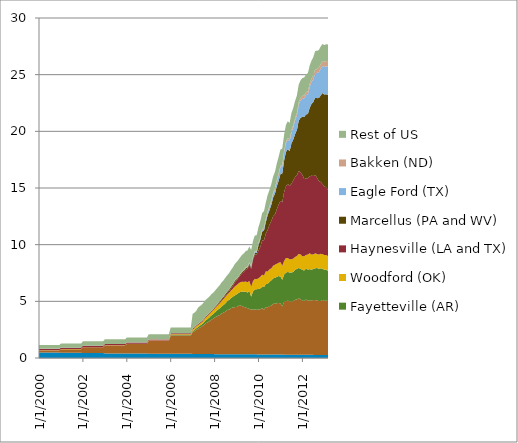
| Category | Antrim (MI, IN, and OH) | Barnett (TX) | Fayetteville (AR) | Woodford (OK) | Haynesville (LA and TX) | Marcellus (PA and WV) | Eagle Ford (TX) | Bakken (ND) | Rest of US |
|---|---|---|---|---|---|---|---|---|---|
| 1/1/00 | 0.481 | 0.184 | 0 | 0.009 | 0.128 | 0.001 | 0 | 0.005 | 0.332 |
| 2/1/00 | 0.481 | 0.184 | 0 | 0.009 | 0.128 | 0.001 | 0 | 0.005 | 0.332 |
| 3/1/00 | 0.481 | 0.184 | 0 | 0.009 | 0.128 | 0.001 | 0 | 0.005 | 0.332 |
| 4/1/00 | 0.481 | 0.184 | 0 | 0.009 | 0.128 | 0.001 | 0 | 0.005 | 0.332 |
| 5/1/00 | 0.481 | 0.184 | 0 | 0.009 | 0.128 | 0.001 | 0 | 0.005 | 0.332 |
| 6/1/00 | 0.481 | 0.184 | 0 | 0.009 | 0.128 | 0.001 | 0 | 0.005 | 0.332 |
| 7/1/00 | 0.481 | 0.184 | 0 | 0.009 | 0.128 | 0.001 | 0 | 0.005 | 0.332 |
| 8/1/00 | 0.481 | 0.184 | 0 | 0.009 | 0.128 | 0.001 | 0 | 0.005 | 0.332 |
| 9/1/00 | 0.481 | 0.184 | 0 | 0.009 | 0.128 | 0.001 | 0 | 0.005 | 0.332 |
| 10/1/00 | 0.481 | 0.184 | 0 | 0.009 | 0.128 | 0.001 | 0 | 0.005 | 0.332 |
| 11/1/00 | 0.481 | 0.184 | 0 | 0.009 | 0.128 | 0.001 | 0 | 0.005 | 0.332 |
| 12/1/00 | 0.481 | 0.184 | 0 | 0.009 | 0.128 | 0.001 | 0 | 0.005 | 0.332 |
| 1/1/01 | 0.461 | 0.314 | 0 | 0.009 | 0.125 | 0.001 | 0 | 0.005 | 0.359 |
| 2/1/01 | 0.461 | 0.314 | 0 | 0.009 | 0.125 | 0.001 | 0 | 0.005 | 0.359 |
| 3/1/01 | 0.461 | 0.314 | 0 | 0.009 | 0.125 | 0.001 | 0 | 0.005 | 0.359 |
| 4/1/01 | 0.461 | 0.314 | 0 | 0.009 | 0.125 | 0.001 | 0 | 0.005 | 0.359 |
| 5/1/01 | 0.461 | 0.314 | 0 | 0.009 | 0.125 | 0.001 | 0 | 0.005 | 0.359 |
| 6/1/01 | 0.461 | 0.314 | 0 | 0.009 | 0.125 | 0.001 | 0 | 0.005 | 0.359 |
| 7/1/01 | 0.461 | 0.314 | 0 | 0.009 | 0.125 | 0.001 | 0 | 0.005 | 0.359 |
| 8/1/01 | 0.461 | 0.314 | 0 | 0.009 | 0.125 | 0.001 | 0 | 0.005 | 0.359 |
| 9/1/01 | 0.461 | 0.314 | 0 | 0.009 | 0.125 | 0.001 | 0 | 0.005 | 0.359 |
| 10/1/01 | 0.461 | 0.314 | 0 | 0.009 | 0.125 | 0.001 | 0 | 0.005 | 0.359 |
| 11/1/01 | 0.461 | 0.314 | 0 | 0.009 | 0.125 | 0.001 | 0 | 0.005 | 0.359 |
| 12/1/01 | 0.461 | 0.314 | 0 | 0.009 | 0.125 | 0.001 | 0 | 0.005 | 0.359 |
| 1/1/02 | 0.438 | 0.508 | 0 | 0.009 | 0.121 | 0 | 0 | 0.004 | 0.39 |
| 2/1/02 | 0.438 | 0.508 | 0 | 0.009 | 0.121 | 0 | 0 | 0.004 | 0.39 |
| 3/1/02 | 0.438 | 0.508 | 0 | 0.009 | 0.121 | 0 | 0 | 0.004 | 0.39 |
| 4/1/02 | 0.438 | 0.508 | 0 | 0.009 | 0.121 | 0 | 0 | 0.004 | 0.39 |
| 5/1/02 | 0.438 | 0.508 | 0 | 0.009 | 0.121 | 0 | 0 | 0.004 | 0.39 |
| 6/1/02 | 0.438 | 0.508 | 0 | 0.009 | 0.121 | 0 | 0 | 0.004 | 0.39 |
| 7/1/02 | 0.438 | 0.508 | 0 | 0.009 | 0.121 | 0 | 0 | 0.004 | 0.39 |
| 8/1/02 | 0.438 | 0.508 | 0 | 0.009 | 0.121 | 0 | 0 | 0.004 | 0.39 |
| 9/1/02 | 0.438 | 0.508 | 0 | 0.009 | 0.121 | 0 | 0 | 0.004 | 0.39 |
| 10/1/02 | 0.438 | 0.508 | 0 | 0.009 | 0.121 | 0 | 0 | 0.004 | 0.39 |
| 11/1/02 | 0.438 | 0.508 | 0 | 0.009 | 0.121 | 0 | 0 | 0.004 | 0.39 |
| 12/1/02 | 0.438 | 0.508 | 0 | 0.009 | 0.121 | 0 | 0 | 0.004 | 0.39 |
| 1/1/03 | 0.405 | 0.706 | 0 | 0.01 | 0.106 | 0 | 0 | 0.004 | 0.414 |
| 2/1/03 | 0.405 | 0.706 | 0 | 0.01 | 0.106 | 0 | 0 | 0.004 | 0.414 |
| 3/1/03 | 0.405 | 0.706 | 0 | 0.01 | 0.106 | 0 | 0 | 0.004 | 0.414 |
| 4/1/03 | 0.405 | 0.706 | 0 | 0.01 | 0.106 | 0 | 0 | 0.004 | 0.414 |
| 5/1/03 | 0.405 | 0.706 | 0 | 0.01 | 0.106 | 0 | 0 | 0.004 | 0.414 |
| 6/1/03 | 0.405 | 0.706 | 0 | 0.01 | 0.106 | 0 | 0 | 0.004 | 0.414 |
| 7/1/03 | 0.405 | 0.706 | 0 | 0.01 | 0.106 | 0 | 0 | 0.004 | 0.414 |
| 8/1/03 | 0.405 | 0.706 | 0 | 0.01 | 0.106 | 0 | 0 | 0.004 | 0.414 |
| 9/1/03 | 0.405 | 0.706 | 0 | 0.01 | 0.106 | 0 | 0 | 0.004 | 0.414 |
| 10/1/03 | 0.405 | 0.706 | 0 | 0.01 | 0.106 | 0 | 0 | 0.004 | 0.414 |
| 11/1/03 | 0.405 | 0.706 | 0 | 0.01 | 0.106 | 0 | 0 | 0.004 | 0.414 |
| 12/1/03 | 0.405 | 0.706 | 0 | 0.01 | 0.106 | 0 | 0 | 0.004 | 0.414 |
| 1/1/04 | 0.391 | 0.857 | 0 | 0.015 | 0.097 | 0 | 0 | 0.004 | 0.437 |
| 2/1/04 | 0.391 | 0.857 | 0 | 0.015 | 0.097 | 0 | 0 | 0.004 | 0.437 |
| 3/1/04 | 0.391 | 0.857 | 0 | 0.015 | 0.097 | 0 | 0 | 0.004 | 0.437 |
| 4/1/04 | 0.391 | 0.857 | 0 | 0.015 | 0.097 | 0 | 0 | 0.004 | 0.437 |
| 5/1/04 | 0.391 | 0.857 | 0 | 0.015 | 0.097 | 0 | 0 | 0.004 | 0.437 |
| 6/1/04 | 0.391 | 0.857 | 0 | 0.015 | 0.097 | 0 | 0 | 0.004 | 0.437 |
| 7/1/04 | 0.391 | 0.857 | 0 | 0.015 | 0.097 | 0 | 0 | 0.004 | 0.437 |
| 8/1/04 | 0.391 | 0.857 | 0 | 0.015 | 0.097 | 0 | 0 | 0.004 | 0.437 |
| 9/1/04 | 0.391 | 0.857 | 0 | 0.015 | 0.097 | 0 | 0 | 0.004 | 0.437 |
| 10/1/04 | 0.391 | 0.857 | 0 | 0.015 | 0.097 | 0 | 0 | 0.004 | 0.437 |
| 11/1/04 | 0.391 | 0.857 | 0 | 0.015 | 0.097 | 0 | 0 | 0.004 | 0.437 |
| 12/1/04 | 0.391 | 0.857 | 0 | 0.015 | 0.097 | 0 | 0 | 0.004 | 0.437 |
| 1/1/05 | 0.381 | 1.134 | 0.006 | 0.025 | 0.091 | 0.002 | 0 | 0.005 | 0.459 |
| 2/1/05 | 0.381 | 1.134 | 0.006 | 0.025 | 0.091 | 0.002 | 0 | 0.005 | 0.459 |
| 3/1/05 | 0.381 | 1.134 | 0.006 | 0.025 | 0.091 | 0.002 | 0 | 0.005 | 0.459 |
| 4/1/05 | 0.381 | 1.134 | 0.006 | 0.025 | 0.091 | 0.002 | 0 | 0.005 | 0.459 |
| 5/1/05 | 0.381 | 1.134 | 0.006 | 0.025 | 0.091 | 0.002 | 0 | 0.005 | 0.459 |
| 6/1/05 | 0.381 | 1.134 | 0.006 | 0.025 | 0.091 | 0.002 | 0 | 0.005 | 0.459 |
| 7/1/05 | 0.381 | 1.134 | 0.006 | 0.025 | 0.091 | 0.002 | 0 | 0.005 | 0.459 |
| 8/1/05 | 0.381 | 1.134 | 0.006 | 0.025 | 0.091 | 0.002 | 0 | 0.005 | 0.459 |
| 9/1/05 | 0.381 | 1.134 | 0.006 | 0.025 | 0.091 | 0.002 | 0 | 0.005 | 0.459 |
| 10/1/05 | 0.381 | 1.134 | 0.006 | 0.025 | 0.091 | 0.002 | 0 | 0.005 | 0.459 |
| 11/1/05 | 0.381 | 1.134 | 0.006 | 0.025 | 0.091 | 0.002 | 0 | 0.005 | 0.459 |
| 12/1/05 | 0.381 | 1.134 | 0.006 | 0.025 | 0.091 | 0.002 | 0 | 0.005 | 0.459 |
| 1/1/06 | 0.373 | 1.61 | 0.04 | 0.071 | 0.082 | 0.012 | 0 | 0.007 | 0.506 |
| 2/1/06 | 0.373 | 1.61 | 0.04 | 0.071 | 0.082 | 0.012 | 0 | 0.007 | 0.506 |
| 3/1/06 | 0.373 | 1.61 | 0.04 | 0.071 | 0.082 | 0.012 | 0 | 0.007 | 0.506 |
| 4/1/06 | 0.373 | 1.61 | 0.04 | 0.071 | 0.082 | 0.012 | 0 | 0.007 | 0.506 |
| 5/1/06 | 0.373 | 1.61 | 0.04 | 0.071 | 0.082 | 0.012 | 0 | 0.007 | 0.506 |
| 6/1/06 | 0.373 | 1.61 | 0.04 | 0.071 | 0.082 | 0.012 | 0 | 0.007 | 0.506 |
| 7/1/06 | 0.373 | 1.61 | 0.04 | 0.071 | 0.082 | 0.012 | 0 | 0.007 | 0.506 |
| 8/1/06 | 0.373 | 1.61 | 0.04 | 0.071 | 0.082 | 0.012 | 0 | 0.007 | 0.506 |
| 9/1/06 | 0.373 | 1.61 | 0.04 | 0.071 | 0.082 | 0.012 | 0 | 0.007 | 0.506 |
| 10/1/06 | 0.373 | 1.61 | 0.04 | 0.071 | 0.082 | 0.012 | 0 | 0.007 | 0.506 |
| 11/1/06 | 0.373 | 1.61 | 0.04 | 0.071 | 0.082 | 0.012 | 0 | 0.007 | 0.506 |
| 12/1/06 | 0.373 | 1.61 | 0.04 | 0.071 | 0.082 | 0.012 | 0 | 0.007 | 0.506 |
| 1/1/07 | 0.362 | 1.921 | 0.099 | 0.131 | 0.081 | 0.02 | 0 | 0.009 | 1.271 |
| 2/1/07 | 0.362 | 1.999 | 0.115 | 0.146 | 0.081 | 0.022 | 0 | 0.009 | 1.271 |
| 3/1/07 | 0.362 | 2.123 | 0.138 | 0.166 | 0.079 | 0.023 | 0 | 0.009 | 1.271 |
| 4/1/07 | 0.363 | 2.208 | 0.157 | 0.176 | 0.077 | 0.024 | 0 | 0.013 | 1.434 |
| 5/1/07 | 0.363 | 2.33 | 0.171 | 0.173 | 0.078 | 0.024 | 0 | 0.013 | 1.434 |
| 6/1/07 | 0.363 | 2.41 | 0.193 | 0.189 | 0.078 | 0.026 | 0 | 0.013 | 1.434 |
| 7/1/07 | 0.36 | 2.523 | 0.227 | 0.21 | 0.077 | 0.026 | 0 | 0.016 | 1.452 |
| 8/1/07 | 0.36 | 2.692 | 0.26 | 0.231 | 0.078 | 0.025 | 0 | 0.016 | 1.452 |
| 9/1/07 | 0.36 | 2.769 | 0.288 | 0.257 | 0.08 | 0.029 | 0 | 0.016 | 1.452 |
| 10/1/07 | 0.358 | 2.869 | 0.329 | 0.283 | 0.081 | 0.031 | 0 | 0.019 | 1.426 |
| 11/1/07 | 0.358 | 2.989 | 0.376 | 0.296 | 0.081 | 0.034 | 0 | 0.019 | 1.426 |
| 12/1/07 | 0.358 | 3.086 | 0.405 | 0.322 | 0.081 | 0.036 | 0 | 0.019 | 1.426 |
| 1/1/08 | 0.338 | 3.224 | 0.436 | 0.352 | 0.085 | 0.036 | 0 | 0.015 | 1.41 |
| 2/1/08 | 0.338 | 3.325 | 0.493 | 0.366 | 0.083 | 0.057 | 0 | 0.015 | 1.41 |
| 3/1/08 | 0.338 | 3.398 | 0.564 | 0.398 | 0.084 | 0.077 | 0 | 0.015 | 1.41 |
| 4/1/08 | 0.337 | 3.467 | 0.598 | 0.443 | 0.096 | 0.09 | 0.001 | 0.022 | 1.415 |
| 5/1/08 | 0.337 | 3.602 | 0.633 | 0.494 | 0.102 | 0.109 | 0.001 | 0.022 | 1.415 |
| 6/1/08 | 0.337 | 3.674 | 0.683 | 0.528 | 0.103 | 0.117 | 0.002 | 0.022 | 1.415 |
| 7/1/08 | 0.339 | 3.765 | 0.737 | 0.569 | 0.115 | 0.136 | 0 | 0.029 | 1.423 |
| 8/1/08 | 0.339 | 3.908 | 0.791 | 0.561 | 0.128 | 0.14 | 0 | 0.029 | 1.423 |
| 9/1/08 | 0.339 | 3.917 | 0.874 | 0.63 | 0.151 | 0.139 | 0.002 | 0.029 | 1.423 |
| 10/1/08 | 0.333 | 4.068 | 0.902 | 0.66 | 0.183 | 0.148 | 0.004 | 0.037 | 1.438 |
| 11/1/08 | 0.333 | 4.12 | 0.952 | 0.712 | 0.247 | 0.149 | 0.004 | 0.037 | 1.438 |
| 12/1/08 | 0.333 | 4.152 | 1.034 | 0.788 | 0.347 | 0.155 | 0.004 | 0.037 | 1.438 |
| 1/1/09 | 0.326 | 4.178 | 1.109 | 0.81 | 0.402 | 0.134 | 0.005 | 0.039 | 1.457 |
| 2/1/09 | 0.326 | 4.274 | 1.131 | 0.839 | 0.488 | 0.096 | 0.008 | 0.039 | 1.457 |
| 3/1/09 | 0.326 | 4.3 | 1.196 | 0.864 | 0.586 | 0.111 | 0.011 | 0.039 | 1.457 |
| 4/1/09 | 0.327 | 4.259 | 1.282 | 0.866 | 0.739 | 0.115 | 0.014 | 0.048 | 1.448 |
| 5/1/09 | 0.327 | 4.181 | 1.343 | 0.862 | 0.885 | 0.121 | 0.018 | 0.048 | 1.448 |
| 6/1/09 | 0.327 | 4.122 | 1.417 | 0.879 | 1.05 | 0.12 | 0.023 | 0.048 | 1.448 |
| 7/1/09 | 0.331 | 4.066 | 1.384 | 0.899 | 1.19 | 0.122 | 0.031 | 0.058 | 1.415 |
| 8/1/09 | 0.331 | 3.996 | 1.59 | 0.876 | 1.397 | 0.131 | 0.041 | 0.058 | 1.415 |
| 9/1/09 | 0.331 | 3.942 | 1.141 | 0.866 | 1.587 | 0.14 | 0.052 | 0.058 | 1.415 |
| 10/1/09 | 0.323 | 3.971 | 1.585 | 0.912 | 1.864 | 0.145 | 0.075 | 0.062 | 1.387 |
| 11/1/09 | 0.323 | 3.954 | 1.773 | 0.934 | 2.129 | 0.144 | 0.108 | 0.062 | 1.387 |
| 12/1/09 | 0.323 | 3.935 | 1.815 | 0.886 | 2.181 | 0.131 | 0.108 | 0.062 | 1.387 |
| 1/1/10 | 0.312 | 3.963 | 1.811 | 0.944 | 2.444 | 0.474 | 0.119 | 0.08 | 1.416 |
| 2/1/10 | 0.312 | 3.988 | 1.841 | 1.025 | 2.654 | 0.628 | 0.127 | 0.08 | 1.416 |
| 3/1/10 | 0.312 | 4.085 | 1.898 | 1.055 | 3.014 | 0.786 | 0.139 | 0.08 | 1.416 |
| 4/1/10 | 0.308 | 3.949 | 2 | 1.026 | 3.11 | 0.858 | 0.157 | 0.101 | 1.439 |
| 5/1/10 | 0.308 | 4.189 | 2.028 | 1.122 | 3.316 | 1.025 | 0.192 | 0.101 | 1.439 |
| 6/1/10 | 0.308 | 4.157 | 2.071 | 1.096 | 3.661 | 1.309 | 0.237 | 0.101 | 1.439 |
| 7/1/10 | 0.308 | 4.268 | 2.142 | 1.1 | 3.94 | 1.279 | 0.245 | 0.122 | 1.424 |
| 8/1/10 | 0.308 | 4.314 | 2.228 | 1.061 | 4.172 | 1.433 | 0.278 | 0.122 | 1.424 |
| 9/1/10 | 0.308 | 4.467 | 2.259 | 1.097 | 4.374 | 1.647 | 0.323 | 0.122 | 1.424 |
| 10/1/10 | 0.305 | 4.479 | 2.284 | 1.165 | 4.43 | 1.822 | 0.36 | 0.139 | 1.447 |
| 11/1/10 | 0.305 | 4.534 | 2.317 | 1.153 | 4.808 | 2.04 | 0.413 | 0.139 | 1.447 |
| 12/1/10 | 0.305 | 4.55 | 2.378 | 1.174 | 5.145 | 2.074 | 0.536 | 0.139 | 1.447 |
| 1/1/11 | 0.299 | 4.517 | 2.373 | 1.26 | 5.415 | 2.378 | 0.598 | 0.123 | 1.435 |
| 2/1/11 | 0.299 | 4.257 | 2.345 | 1.237 | 5.604 | 2.537 | 0.645 | 0.123 | 1.435 |
| 3/1/11 | 0.299 | 4.645 | 2.412 | 1.202 | 6.081 | 2.78 | 0.723 | 0.123 | 1.435 |
| 4/1/11 | 0.292 | 4.714 | 2.529 | 1.286 | 6.336 | 3.016 | 0.774 | 0.137 | 1.48 |
| 5/1/11 | 0.292 | 4.774 | 2.532 | 1.222 | 6.553 | 3.062 | 0.841 | 0.137 | 1.48 |
| 6/1/11 | 0.292 | 4.71 | 2.536 | 1.169 | 6.471 | 3.062 | 0.884 | 0.137 | 1.48 |
| 7/1/11 | 0.295 | 4.689 | 2.565 | 1.162 | 6.647 | 3.572 | 0.964 | 0.182 | 1.53 |
| 8/1/11 | 0.295 | 4.727 | 2.565 | 1.179 | 6.906 | 3.596 | 1.08 | 0.182 | 1.53 |
| 9/1/11 | 0.295 | 4.834 | 2.661 | 1.125 | 7.05 | 3.791 | 1.226 | 0.182 | 1.53 |
| 10/1/11 | 0.291 | 4.873 | 2.696 | 1.146 | 7.115 | 3.98 | 1.305 | 0.22 | 1.549 |
| 11/1/11 | 0.291 | 4.966 | 2.682 | 1.244 | 7.313 | 4.439 | 1.428 | 0.22 | 1.549 |
| 12/1/11 | 0.291 | 4.886 | 2.702 | 1.263 | 7.23 | 4.829 | 1.533 | 0.22 | 1.549 |
| 1/1/12 | 0.284 | 4.777 | 2.71 | 1.2 | 7.183 | 5.128 | 1.586 | 0.256 | 1.58 |
| 2/1/12 | 0.284 | 4.749 | 2.685 | 1.26 | 6.806 | 5.481 | 1.647 | 0.256 | 1.58 |
| 3/1/12 | 0.284 | 4.881 | 2.722 | 1.204 | 6.763 | 5.64 | 1.705 | 0.256 | 1.58 |
| 4/1/12 | 0.279 | 4.765 | 2.756 | 1.336 | 6.714 | 5.68 | 1.724 | 0.3 | 1.585 |
| 5/1/12 | 0.279 | 4.829 | 2.734 | 1.4 | 6.785 | 6.048 | 1.852 | 0.3 | 1.585 |
| 6/1/12 | 0.279 | 4.773 | 2.737 | 1.342 | 6.957 | 6.347 | 1.928 | 0.3 | 1.585 |
| 7/1/12 | 0.275 | 4.852 | 2.733 | 1.281 | 6.91 | 6.547 | 2.003 | 0.341 | 1.617 |
| 8/1/12 | 0.275 | 4.825 | 2.818 | 1.321 | 6.92 | 6.834 | 2.144 | 0.341 | 1.617 |
| 9/1/12 | 0.275 | 4.817 | 2.846 | 1.241 | 6.731 | 7.018 | 2.216 | 0.341 | 1.617 |
| 10/1/12 | 0.271 | 4.751 | 2.855 | 1.252 | 6.488 | 7.322 | 2.288 | 0.4 | 1.551 |
| 11/1/12 | 0.271 | 4.767 | 2.876 | 1.277 | 6.34 | 7.644 | 2.356 | 0.4 | 1.551 |
| 12/1/12 | 0.271 | 4.843 | 2.767 | 1.284 | 6.177 | 8.042 | 2.378 | 0.4 | 1.551 |
| 1/1/13 | 0.266 | 4.767 | 2.747 | 1.302 | 6.057 | 8.108 | 2.423 | 0.464 | 1.476 |
| 2/1/13 | 0.266 | 4.806 | 2.727 | 1.297 | 5.956 | 8.222 | 2.47 | 0.464 | 1.476 |
| 3/1/13 | 0.266 | 4.759 | 2.651 | 1.311 | 5.85 | 8.365 | 2.52 | 0.464 | 1.476 |